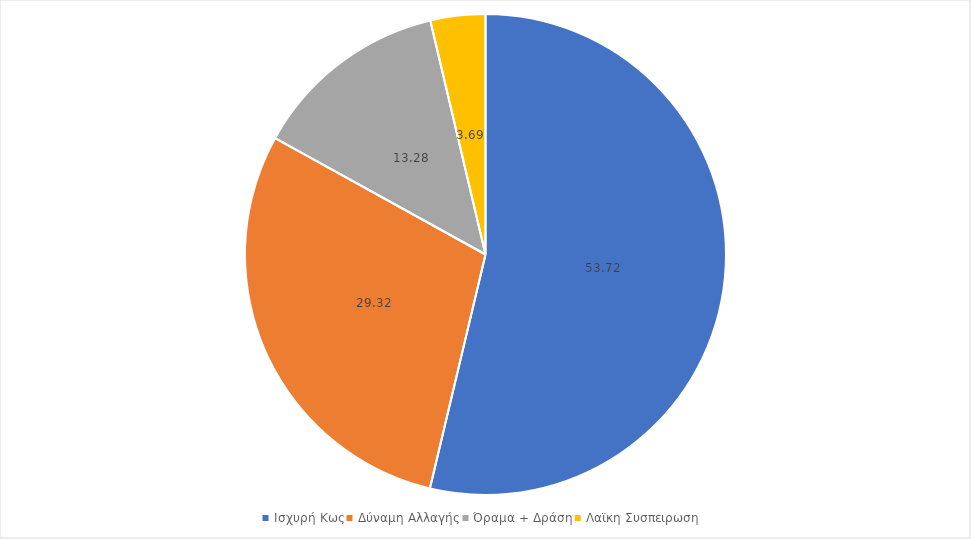
| Category | Series 0 |
|---|---|
| Ισχυρή Κως | 53.716 |
| Δύναμη Αλλαγής | 29.315 |
| Όραμα + Δράση | 13.283 |
| Λαϊκη Συσπειρωση | 3.686 |